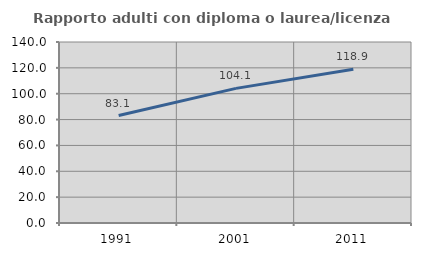
| Category | Rapporto adulti con diploma o laurea/licenza media  |
|---|---|
| 1991.0 | 83.088 |
| 2001.0 | 104.136 |
| 2011.0 | 118.85 |